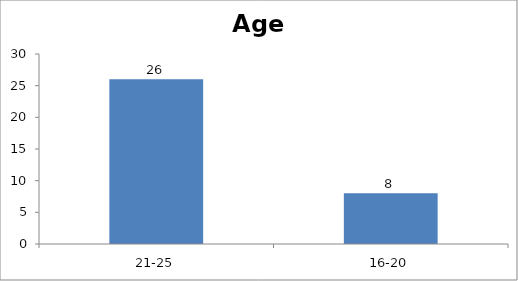
| Category | Age |
|---|---|
| 21-25 | 26 |
| 16-20 | 8 |